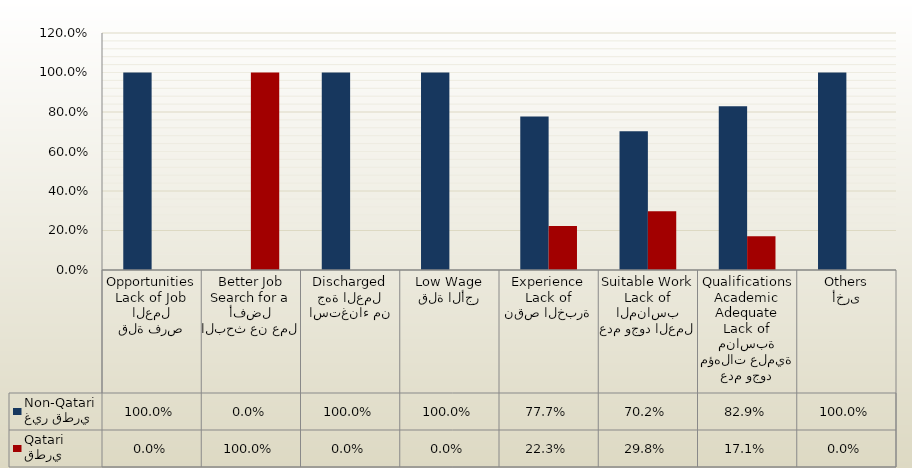
| Category | غير قطري
Non-Qatari | قطري
Qatari |
|---|---|---|
| قلة فرص العمل
Lack of Job Opportunities | 1 | 0 |
| البحث عن عمل أفضل
Search for a Better Job | 0 | 1 |
| استغناء من جهة العمل
Discharged | 1 | 0 |
| قلة الأجر
Low Wage | 1 | 0 |
| نقص الخبرة
Lack of Experience | 0.777 | 0.223 |
| عدم وجود العمل المناسب
Lack of Suitable Work | 0.702 | 0.298 |
| عدم وجود مؤهلات علمية مناسبة
Lack of Adequate Academic Qualifications | 0.829 | 0.171 |
| أخرى
Others | 1 | 0 |